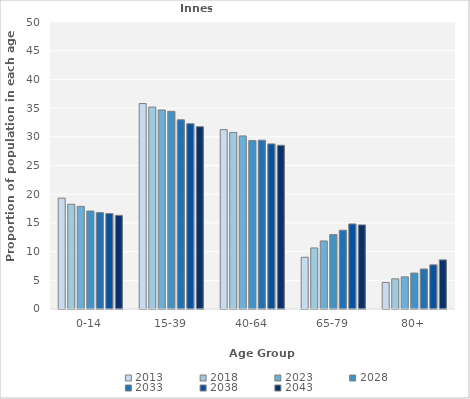
| Category | 2013 | 2018 | 2023 | 2028 | 2033 | 2038 | 2043 |
|---|---|---|---|---|---|---|---|
| 0-14 | 19.313 | 18.247 | 17.876 | 17.07 | 16.794 | 16.622 | 16.314 |
| 15-39 | 35.794 | 35.179 | 34.672 | 34.432 | 32.962 | 32.274 | 31.763 |
| 40-64 | 31.245 | 30.757 | 30.154 | 29.341 | 29.408 | 28.763 | 28.526 |
| 65-79 | 9.013 | 10.637 | 11.853 | 12.967 | 13.728 | 14.816 | 14.647 |
| 80+ | 4.635 | 5.259 | 5.598 | 6.264 | 6.969 | 7.692 | 8.558 |